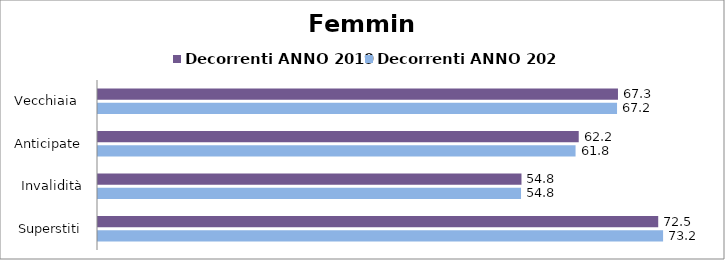
| Category | Decorrenti ANNO 2019 | Decorrenti ANNO 2020 |
|---|---|---|
| Vecchiaia  | 67.31 | 67.19 |
|  Anticipate | 62.23 | 61.82 |
| Invalidità | 54.82 | 54.76 |
| Superstiti | 72.52 | 73.15 |